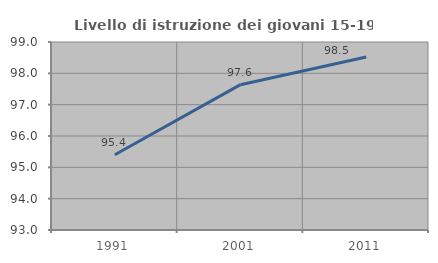
| Category | Livello di istruzione dei giovani 15-19 anni |
|---|---|
| 1991.0 | 95.402 |
| 2001.0 | 97.638 |
| 2011.0 | 98.519 |